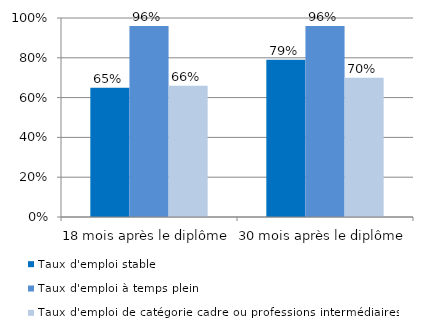
| Category | Taux d'emploi stable | Taux d'emploi à temps plein | Taux d'emploi de catégorie cadre ou professions intermédiaires |
|---|---|---|---|
| 18 mois après le diplôme | 0.65 | 0.96 | 0.66 |
| 30 mois après le diplôme | 0.79 | 0.96 | 0.7 |